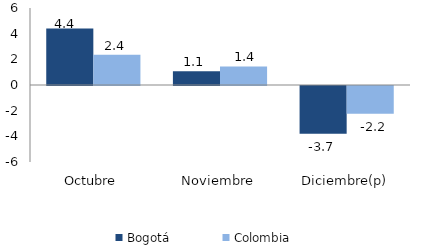
| Category | Bogotá | Colombia |
|---|---|---|
| Octubre | 4.395 | 2.351 |
| Noviembre | 1.078 | 1.446 |
| Diciembre(p) | -3.718 | -2.167 |